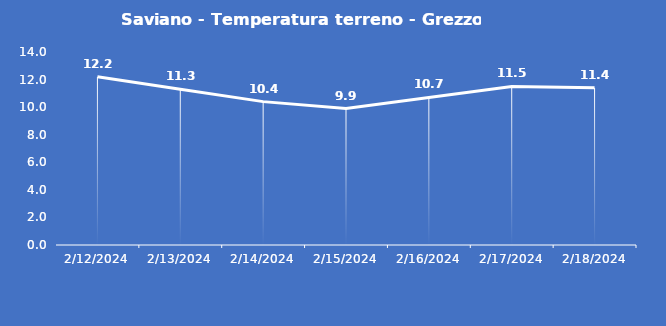
| Category | Saviano - Temperatura terreno - Grezzo (°C) |
|---|---|
| 2/12/24 | 12.2 |
| 2/13/24 | 11.3 |
| 2/14/24 | 10.4 |
| 2/15/24 | 9.9 |
| 2/16/24 | 10.7 |
| 2/17/24 | 11.5 |
| 2/18/24 | 11.4 |